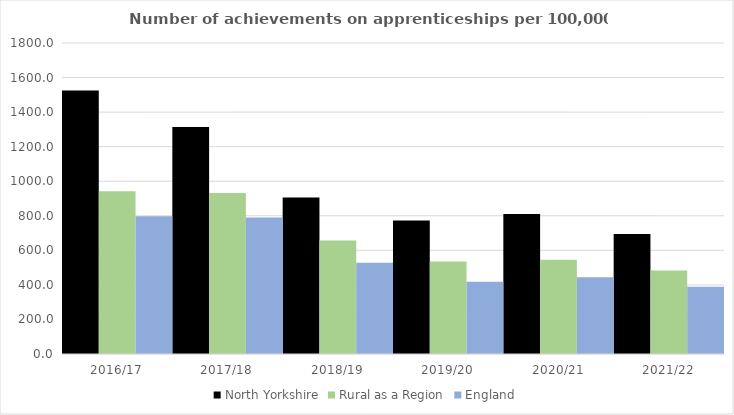
| Category | North Yorkshire | Rural as a Region | England |
|---|---|---|---|
| 2016/17 | 1525.309 | 942.594 | 797 |
| 2017/18 | 1314.426 | 931.709 | 790 |
| 2018/19 | 905.983 | 656.44 | 528 |
| 2019/20 | 773.296 | 535.552 | 418 |
| 2020/21 | 810.336 | 545.333 | 444 |
| 2021/22 | 694.512 | 482.936 | 389 |